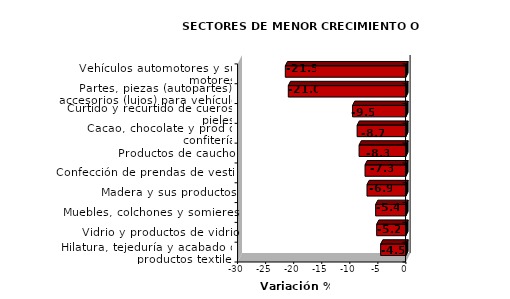
| Category | Series 0 |
|---|---|
| Vehículos automotores y sus motores | -21.488 |
| Partes, piezas (autopartes) y accesorios (lujos) para vehículos | -20.953 |
| Curtido y recurtido de cueros y pieles | -9.504 |
| Cacao, chocolate y prod de confitería | -8.694 |
| Productos de caucho | -8.345 |
| Confección de prendas de vestir | -7.283 |
| Madera y sus productos | -6.934 |
| Muebles, colchones y somieres | -5.394 |
| Vidrio y productos de vidrio | -5.209 |
| Hilatura, tejeduría y acabado de productos textiles | -4.504 |